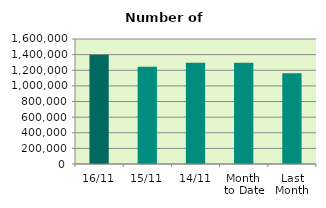
| Category | Series 0 |
|---|---|
| 16/11 | 1399760 |
| 15/11 | 1244724 |
| 14/11 | 1297270 |
| Month 
to Date | 1295859.833 |
| Last
Month | 1161301.714 |